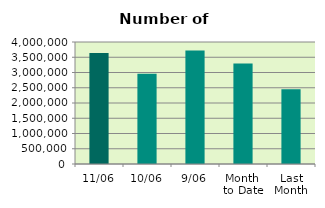
| Category | Series 0 |
|---|---|
| 11/06 | 3638394 |
| 10/06 | 2956480 |
| 9/06 | 3720866 |
| Month 
to Date | 3293816.222 |
| Last
Month | 2451339.2 |